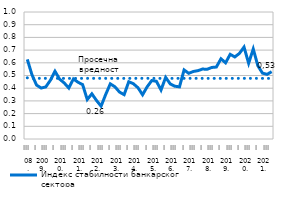
| Category | Индекс стабилности банкарског сектора | Просечна вредност |
|---|---|---|
| 0 | 0.627 | 0.482 |
| 1 | 0.507 | 0.477 |
| 2 | 0.425 | 0.477 |
| 3 | 0.401 | 0.477 |
| 4 | 0.41 | 0.477 |
| 5 | 0.462 | 0.477 |
| 6 | 0.533 | 0.477 |
| 7 | 0.472 | 0.477 |
| 8 | 0.441 | 0.477 |
| 9 | 0.401 | 0.477 |
| 10 | 0.473 | 0.477 |
| 11 | 0.447 | 0.477 |
| 12 | 0.428 | 0.477 |
| 13 | 0.311 | 0.477 |
| 14 | 0.356 | 0.477 |
| 15 | 0.304 | 0.477 |
| 16 | 0.259 | 0.477 |
| 17 | 0.351 | 0.477 |
| 18 | 0.434 | 0.477 |
| 19 | 0.411 | 0.477 |
| 20 | 0.369 | 0.477 |
| 21 | 0.349 | 0.477 |
| 22 | 0.451 | 0.477 |
| 23 | 0.435 | 0.477 |
| 24 | 0.404 | 0.477 |
| 25 | 0.348 | 0.477 |
| 26 | 0.411 | 0.477 |
| 27 | 0.46 | 0.477 |
| 28 | 0.454 | 0.477 |
| 29 | 0.386 | 0.477 |
| 30 | 0.485 | 0.477 |
| 31 | 0.434 | 0.477 |
| 32 | 0.416 | 0.477 |
| 33 | 0.41 | 0.477 |
| 34 | 0.544 | 0.477 |
| 35 | 0.517 | 0.477 |
| 36 | 0.532 | 0.477 |
| 37 | 0.538 | 0.477 |
| 38 | 0.551 | 0.477 |
| 39 | 0.549 | 0.477 |
| 40 | 0.563 | 0.477 |
| 41 | 0.567 | 0.477 |
| 42 | 0.632 | 0.477 |
| 43 | 0.6 | 0.477 |
| 44 | 0.667 | 0.477 |
| 45 | 0.646 | 0.477 |
| 46 | 0.674 | 0.477 |
| 47 | 0.724 | 0.477 |
| 48 | 0.596 | 0.477 |
| 49 | 0.709 | 0.477 |
| 50 | 0.576 | 0.477 |
| 51 | 0.519 | 0.477 |
| 52 | 0.509 | 0.477 |
| 53 | 0.53 | 0.477 |